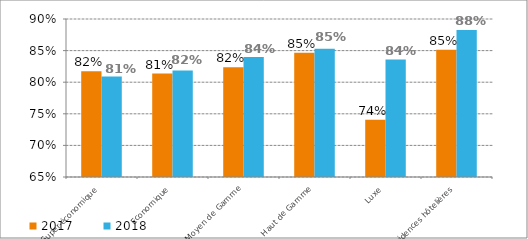
| Category | 2017 | 2018 |
|---|---|---|
| Super-économique | 0.817 | 0.809 |
| Economique | 0.814 | 0.819 |
| Moyen de Gamme | 0.824 | 0.84 |
| Haut de Gamme | 0.847 | 0.853 |
| Luxe | 0.74 | 0.836 |
| Résidences hôtelières | 0.851 | 0.883 |